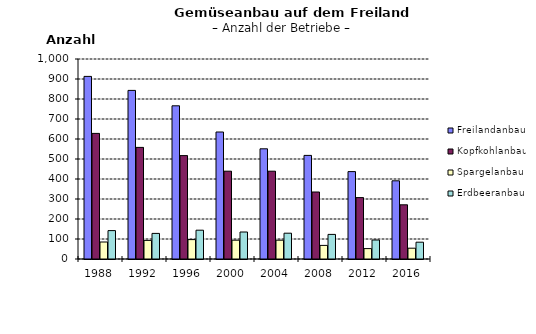
| Category | Freilandanbau | Kopfkohlanbau | Spargelanbau | Erdbeeranbau |
|---|---|---|---|---|
| 1988.0 | 913 | 628 | 85 | 142 |
| 1992.0 | 843 | 558 | 93 | 128 |
| 1996.0 | 766 | 517 | 97 | 144 |
| 2000.0 | 635 | 439 | 94 | 135 |
| 2004.0 | 551 | 439 | 94 | 129 |
| 2008.0 | 518 | 335 | 68 | 123 |
| 2012.0 | 437 | 307 | 52 | 95 |
| 2016.0 | 391 | 271 | 54 | 84 |